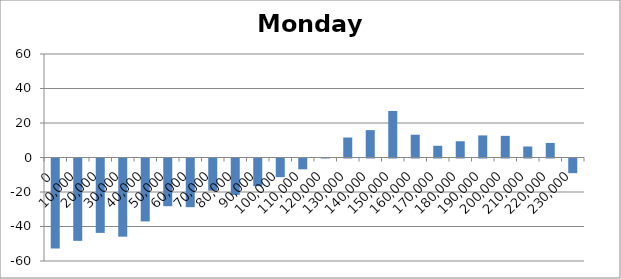
| Category | Monday 96 |
|---|---|
| 0.0 | -52.19 |
| 10000.0 | -47.745 |
| 20000.0 | -43.13 |
| 30000.0 | -45.31 |
| 40000.0 | -36.475 |
| 50000.0 | -27.65 |
| 60000.0 | -28.215 |
| 70000.0 | -18.67 |
| 80000.0 | -21.075 |
| 90000.0 | -16.02 |
| 100000.0 | -10.805 |
| 110000.0 | -6.28 |
| 120000.0 | 0.265 |
| 130000.0 | 11.59 |
| 140000.0 | 15.87 |
| 150000.0 | 26.975 |
| 160000.0 | 13.215 |
| 170000.0 | 6.8 |
| 180000.0 | 9.41 |
| 190000.0 | 12.805 |
| 200000.0 | 12.54 |
| 210000.0 | 6.385 |
| 220000.0 | 8.441 |
| 230000.0 | -8.5 |